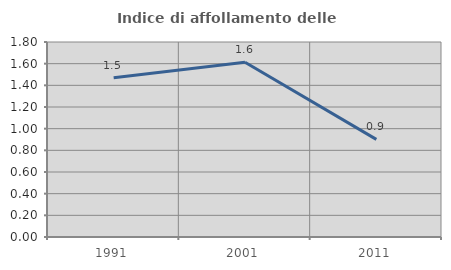
| Category | Indice di affollamento delle abitazioni  |
|---|---|
| 1991.0 | 1.471 |
| 2001.0 | 1.613 |
| 2011.0 | 0.901 |